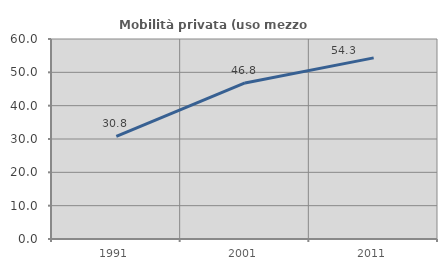
| Category | Mobilità privata (uso mezzo privato) |
|---|---|
| 1991.0 | 30.787 |
| 2001.0 | 46.822 |
| 2011.0 | 54.335 |